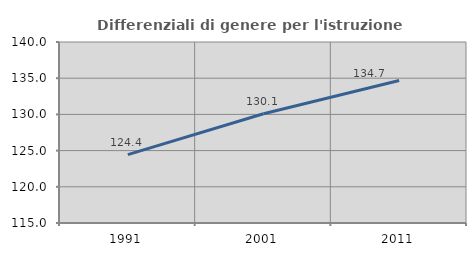
| Category | Differenziali di genere per l'istruzione superiore |
|---|---|
| 1991.0 | 124.444 |
| 2001.0 | 130.095 |
| 2011.0 | 134.683 |